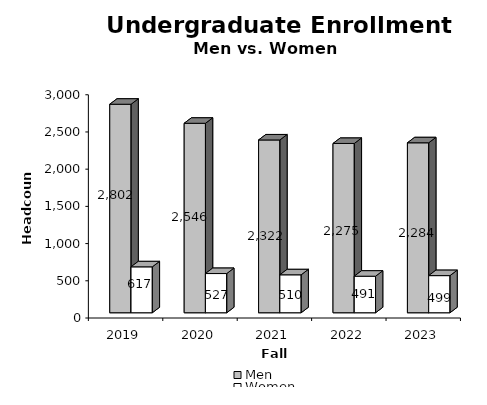
| Category | Men | Women |
|---|---|---|
| 2019.0 | 2802 | 617 |
| 2020.0 | 2546 | 527 |
| 2021.0 | 2322 | 510 |
| 2022.0 | 2275 | 491 |
| 2023.0 | 2284 | 499 |